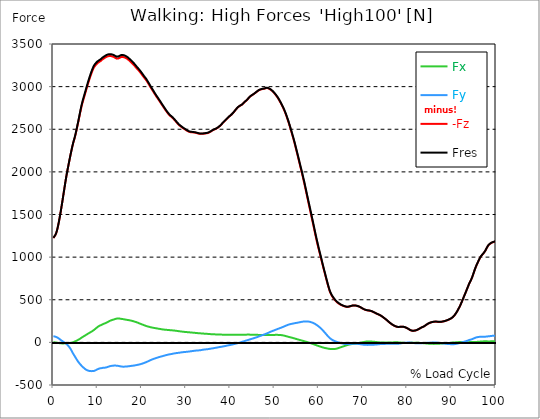
| Category |  Fx |  Fy |  -Fz |  Fres |
|---|---|---|---|---|
| 0.0 | 1.688 | 72.598 | 1223.997 | 1226.403 |
| 0.1646090534979424 | 0.781 | 70.536 | 1236.544 | 1238.81 |
| 0.3292181069958848 | -0.125 | 68.489 | 1249.107 | 1251.217 |
| 0.5041152263374485 | -1 | 66.176 | 1263.28 | 1265.218 |
| 0.668724279835391 | -2.016 | 63.223 | 1285.094 | 1286.86 |
| 0.8333333333333333 | -3.594 | 59.175 | 1314.346 | 1315.893 |
| 0.9979423868312757 | -5.344 | 53.894 | 1351.145 | 1352.473 |
| 1.162551440329218 | -7.125 | 48.128 | 1391.319 | 1392.429 |
| 1.337448559670782 | -8.751 | 41.612 | 1437.431 | 1438.353 |
| 1.5020576131687242 | -10.251 | 34.908 | 1485.247 | 1486.013 |
| 1.6666666666666665 | -11.094 | 28.08 | 1535.859 | 1536.453 |
| 1.831275720164609 | -11.751 | 21.658 | 1588.628 | 1589.097 |
| 1.9958847736625513 | -12.47 | 15.438 | 1641.616 | 1641.991 |
| 2.170781893004115 | -12.235 | 9.579 | 1696.963 | 1697.26 |
| 2.3353909465020575 | -11.969 | 4.172 | 1753.17 | 1753.435 |
| 2.4999999999999996 | -11.657 | -1.406 | 1808.173 | 1808.407 |
| 2.6646090534979425 | -11.423 | -7.125 | 1863.348 | 1863.598 |
| 2.829218106995885 | -11.079 | -13.204 | 1917.008 | 1917.289 |
| 3.0041152263374484 | -10.673 | -20.626 | 1967.136 | 1967.526 |
| 3.168724279835391 | -10.032 | -29.127 | 2014.201 | 2014.732 |
| 3.333333333333333 | -9.141 | -38.409 | 2058.266 | 2059.001 |
| 3.497942386831276 | -8.172 | -48.3 | 2101.488 | 2102.441 |
| 3.662551440329218 | -7.141 | -59.285 | 2144.725 | 2146.006 |
| 3.837448559670782 | -5.86 | -72.223 | 2187.384 | 2189.165 |
| 4.002057613168724 | -4.5 | -86.802 | 2228.761 | 2231.167 |
| 4.166666666666667 | -2.875 | -102.6 | 2268.201 | 2271.311 |
| 4.3312757201646095 | -0.969 | -118.992 | 2306.485 | 2310.297 |
| 4.495884773662552 | 1.844 | -134.696 | 2340.924 | 2345.518 |
| 4.670781893004115 | 5.797 | -148.712 | 2370.707 | 2376.145 |
| 4.835390946502058 | 9.735 | -162.729 | 2400.475 | 2406.772 |
| 4.999999999999999 | 13.923 | -176.839 | 2434.852 | 2442.087 |
| 5.164609053497943 | 18.064 | -190.934 | 2472.604 | 2480.776 |
| 5.329218106995885 | 22.095 | -205.013 | 2512.106 | 2521.248 |
| 5.504115226337448 | 26.658 | -218.154 | 2552.281 | 2562.422 |
| 5.668724279835391 | 31.268 | -230.577 | 2593.018 | 2604.112 |
| 5.833333333333333 | 36.237 | -242.015 | 2634.973 | 2646.974 |
| 5.997942386831276 | 41.456 | -252.922 | 2677.57 | 2690.43 |
| 6.162551440329218 | 47.722 | -261.938 | 2719.713 | 2733.37 |
| 6.337448559670782 | 53.503 | -271.751 | 2758.778 | 2773.326 |
| 6.502057613168724 | 59.144 | -281.252 | 2794.249 | 2809.609 |
| 6.666666666666666 | 64.77 | -289.33 | 2826.032 | 2842.127 |
| 6.831275720164609 | 70.082 | -297.003 | 2856.221 | 2873.019 |
| 6.995884773662552 | 75.067 | -304.362 | 2885.239 | 2902.708 |
| 7.170781893004115 | 80.567 | -312.019 | 2914.631 | 2932.757 |
| 7.3353909465020575 | 86.021 | -318.988 | 2944.305 | 2963.056 |
| 7.500000000000001 | 91.349 | -323.739 | 2974.791 | 2994.011 |
| 7.664609053497942 | 96.803 | -327.708 | 3005.105 | 3024.732 |
| 7.829218106995885 | 102.053 | -330.676 | 3033.998 | 3053.905 |
| 8.004115226337449 | 107.241 | -333.239 | 3061.327 | 3081.516 |
| 8.168724279835391 | 112.444 | -335.552 | 3088.204 | 3108.643 |
| 8.333333333333334 | 117.351 | -336.786 | 3114.284 | 3134.863 |
| 8.497942386831278 | 122.257 | -337.271 | 3139.614 | 3160.255 |
| 8.662551440329219 | 127.102 | -337.333 | 3164.334 | 3185.023 |
| 8.837448559670783 | 132.617 | -337.13 | 3186.585 | 3207.336 |
| 9.002057613168725 | 138.79 | -336.771 | 3206.555 | 3227.4 |
| 9.166666666666668 | 145.274 | -335.536 | 3224.337 | 3245.229 |
| 9.33127572016461 | 151.837 | -332.598 | 3238.26 | 3259.105 |
| 9.495884773662551 | 159.197 | -328.52 | 3249.089 | 3269.84 |
| 9.670781893004117 | 166.338 | -324.129 | 3258.98 | 3279.638 |
| 9.83539094650206 | 173.198 | -319.723 | 3268.543 | 3289.107 |
| 9.999999999999998 | 180.824 | -315.129 | 3276.419 | 3296.936 |
| 10.16460905349794 | 186.933 | -311.144 | 3283.294 | 3303.749 |
| 10.329218106995887 | 192.09 | -307.753 | 3288.732 | 3309.171 |
| 10.504115226337447 | 196.778 | -304.644 | 3293.451 | 3313.905 |
| 10.66872427983539 | 200.387 | -303.206 | 3299.717 | 3320.25 |
| 10.833333333333334 | 203.825 | -302.253 | 3306.858 | 3327.484 |
| 10.997942386831275 | 207.56 | -301.393 | 3315.046 | 3335.766 |
| 11.162551440329217 | 212.247 | -299.628 | 3322.031 | 3342.813 |
| 11.337448559670783 | 217.748 | -296.815 | 3327.969 | 3348.798 |
| 11.502057613168724 | 221.029 | -296.362 | 3331.313 | 3352.283 |
| 11.666666666666666 | 223.404 | -296.534 | 3338.563 | 3359.627 |
| 11.831275720164609 | 226.529 | -295.424 | 3344.767 | 3365.877 |
| 11.995884773662551 | 230.873 | -292.971 | 3349.47 | 3370.612 |
| 12.170781893004115 | 235.827 | -289.799 | 3353.033 | 3374.206 |
| 12.335390946502057 | 239.968 | -287.268 | 3356.158 | 3377.378 |
| 12.5 | 245.562 | -283.627 | 3358.049 | 3379.316 |
| 12.664609053497943 | 249.812 | -280.923 | 3358.924 | 3380.3 |
| 12.829218106995885 | 253.953 | -278.408 | 3359.049 | 3380.534 |
| 13.004115226337449 | 257.438 | -276.97 | 3358.361 | 3380.034 |
| 13.168724279835391 | 260.453 | -275.392 | 3356.674 | 3378.456 |
| 13.333333333333332 | 263.282 | -274.079 | 3354.533 | 3376.425 |
| 13.497942386831276 | 266.001 | -273.22 | 3351.564 | 3373.628 |
| 13.662551440329217 | 268.673 | -272.61 | 3348.001 | 3370.253 |
| 13.837448559670783 | 271.563 | -272.423 | 3342.845 | 3365.362 |
| 14.002057613168724 | 274.704 | -272.313 | 3336.938 | 3359.736 |
| 14.166666666666666 | 277.47 | -272.439 | 3331.875 | 3354.939 |
| 14.33127572016461 | 278.939 | -273.157 | 3328.5 | 3351.767 |
| 14.495884773662551 | 279.689 | -274.11 | 3327.828 | 3351.251 |
| 14.670781893004115 | 280.298 | -275.673 | 3329.422 | 3353.002 |
| 14.835390946502057 | 279.923 | -277.673 | 3333.016 | 3356.689 |
| 15.000000000000002 | 278.892 | -279.673 | 3338.126 | 3361.83 |
| 15.164609053497943 | 277.72 | -281.439 | 3343.72 | 3367.44 |
| 15.329218106995883 | 276.157 | -282.908 | 3347.314 | 3370.971 |
| 15.504115226337449 | 274.986 | -283.97 | 3348.361 | 3372.018 |
| 15.66872427983539 | 273.407 | -284.627 | 3348.111 | 3371.69 |
| 15.833333333333334 | 271.938 | -284.705 | 3346.767 | 3370.237 |
| 15.997942386831276 | 270.657 | -284.658 | 3344.064 | 3367.44 |
| 16.162551440329217 | 268.766 | -284.549 | 3340.766 | 3364.002 |
| 16.337448559670783 | 266.923 | -283.97 | 3336.829 | 3359.908 |
| 16.502057613168724 | 265.313 | -283.033 | 3332.563 | 3355.47 |
| 16.666666666666668 | 264.063 | -282.392 | 3327.094 | 3349.892 |
| 16.83127572016461 | 262.766 | -281.392 | 3320.515 | 3343.157 |
| 16.995884773662556 | 261.157 | -280.33 | 3313.405 | 3335.891 |
| 17.170781893004115 | 259.641 | -279.267 | 3305.608 | 3327.938 |
| 17.33539094650206 | 257.766 | -278.001 | 3297.608 | 3319.734 |
| 17.500000000000004 | 255.984 | -276.689 | 3289.716 | 3311.655 |
| 17.66460905349794 | 254 | -275.486 | 3281.544 | 3303.295 |
| 17.82921810699589 | 251.703 | -274.345 | 3273.184 | 3294.717 |
| 18.00411522633745 | 249.328 | -273.282 | 3264.559 | 3285.857 |
| 18.16872427983539 | 246.89 | -272.173 | 3255.792 | 3276.872 |
| 18.333333333333336 | 244.077 | -270.813 | 3246.026 | 3266.84 |
| 18.497942386831276 | 241.343 | -269.391 | 3235.604 | 3256.168 |
| 18.66255144032922 | 238.686 | -267.719 | 3224.947 | 3245.245 |
| 18.837448559670786 | 235.811 | -265.876 | 3214.743 | 3234.744 |
| 19.002057613168724 | 232.749 | -264.016 | 3205.039 | 3224.712 |
| 19.166666666666668 | 229.092 | -262.282 | 3196.195 | 3215.509 |
| 19.331275720164612 | 225.451 | -260.328 | 3186.679 | 3205.633 |
| 19.495884773662553 | 221.904 | -258.203 | 3176.335 | 3194.929 |
| 19.67078189300412 | 218.404 | -256.016 | 3165.474 | 3183.71 |
| 19.83539094650206 | 214.81 | -253.672 | 3154.333 | 3172.194 |
| 19.999999999999996 | 211.513 | -250.984 | 3142.77 | 3160.255 |
| 20.164609053497944 | 208.231 | -248.062 | 3131.019 | 3148.13 |
| 20.32921810699588 | 204.919 | -245.046 | 3119.565 | 3136.301 |
| 20.504115226337447 | 201.575 | -241.78 | 3108.002 | 3124.331 |
| 20.66872427983539 | 198.356 | -238.405 | 3097.22 | 3113.143 |
| 20.833333333333332 | 195.262 | -235.014 | 3086.642 | 3102.158 |
| 20.997942386831276 | 191.855 | -231.467 | 3074.891 | 3089.954 |
| 21.162551440329217 | 189.121 | -227.795 | 3061.953 | 3076.625 |
| 21.33744855967078 | 186.543 | -223.92 | 3047.999 | 3062.281 |
| 21.502057613168724 | 184.261 | -220.076 | 3034.17 | 3048.077 |
| 21.666666666666668 | 182.011 | -216.138 | 3019.809 | 3033.373 |
| 21.83127572016461 | 179.745 | -211.779 | 3004.996 | 3018.184 |
| 21.99588477366255 | 177.573 | -207.778 | 2990.683 | 3003.511 |
| 22.170781893004115 | 175.573 | -204.153 | 2977.057 | 2989.573 |
| 22.335390946502056 | 173.807 | -200.528 | 2963.54 | 2975.76 |
| 22.5 | 172.104 | -197.043 | 2949.727 | 2961.65 |
| 22.664609053497944 | 170.401 | -193.777 | 2935.57 | 2947.242 |
| 22.82921810699588 | 168.901 | -190.699 | 2921.6 | 2933.023 |
| 23.004115226337447 | 167.51 | -187.871 | 2907.896 | 2919.116 |
| 23.16872427983539 | 165.823 | -184.871 | 2894.067 | 2905.052 |
| 23.333333333333332 | 164.291 | -181.933 | 2881.066 | 2891.833 |
| 23.497942386831276 | 162.635 | -178.87 | 2869.41 | 2879.926 |
| 23.662551440329217 | 161.104 | -176.042 | 2856.346 | 2866.644 |
| 23.83744855967078 | 159.697 | -173.417 | 2843.033 | 2853.127 |
| 24.002057613168727 | 158.275 | -171.135 | 2830.267 | 2840.205 |
| 24.166666666666664 | 156.775 | -168.792 | 2817.438 | 2827.188 |
| 24.33127572016461 | 155.244 | -166.37 | 2804.64 | 2814.203 |
| 24.495884773662553 | 153.853 | -163.916 | 2791.42 | 2800.812 |
| 24.670781893004115 | 152.447 | -161.65 | 2778.466 | 2787.686 |
| 24.83539094650206 | 151.165 | -159.307 | 2765.45 | 2774.497 |
| 25.0 | 150.072 | -156.9 | 2752.449 | 2761.34 |
| 25.164609053497944 | 149.197 | -154.384 | 2739.511 | 2748.262 |
| 25.329218106995885 | 148.4 | -151.806 | 2726.666 | 2735.261 |
| 25.504115226337447 | 147.587 | -149.478 | 2714.322 | 2722.791 |
| 25.66872427983539 | 146.775 | -147.29 | 2702.337 | 2710.697 |
| 25.833333333333332 | 146.087 | -145.134 | 2690.867 | 2699.102 |
| 25.997942386831276 | 145.274 | -143.196 | 2679.82 | 2687.961 |
| 26.16255144032922 | 144.384 | -141.368 | 2669.554 | 2677.601 |
| 26.337448559670783 | 143.431 | -139.759 | 2660.178 | 2668.116 |
| 26.502057613168724 | 142.696 | -138.212 | 2653.209 | 2661.053 |
| 26.666666666666664 | 141.946 | -136.665 | 2646.255 | 2654.006 |
| 26.83127572016461 | 141.227 | -135.008 | 2639.052 | 2646.693 |
| 26.995884773662553 | 140.571 | -133.149 | 2631.395 | 2638.911 |
| 27.170781893004115 | 139.68 | -131.258 | 2622.207 | 2629.614 |
| 27.33539094650206 | 138.758 | -129.445 | 2612.253 | 2619.535 |
| 27.499999999999996 | 137.805 | -127.883 | 2602.596 | 2609.784 |
| 27.66460905349794 | 136.555 | -126.742 | 2592.736 | 2599.846 |
| 27.829218106995885 | 135.305 | -125.664 | 2582.673 | 2589.689 |
| 28.004115226337447 | 134.024 | -124.539 | 2572.329 | 2579.251 |
| 28.16872427983539 | 132.664 | -123.461 | 2562.438 | 2569.251 |
| 28.333333333333332 | 131.43 | -122.179 | 2553.218 | 2559.938 |
| 28.49794238683128 | 130.242 | -120.976 | 2545.655 | 2552.265 |
| 28.66255144032922 | 129.164 | -119.695 | 2538.53 | 2545.062 |
| 28.837448559670783 | 128.07 | -118.226 | 2531.811 | 2538.233 |
| 29.002057613168724 | 127.008 | -117.023 | 2525.264 | 2531.608 |
| 29.166666666666664 | 125.961 | -115.898 | 2518.794 | 2525.06 |
| 29.331275720164612 | 124.976 | -114.71 | 2512.638 | 2518.826 |
| 29.495884773662553 | 123.929 | -113.726 | 2506.919 | 2513.028 |
| 29.670781893004115 | 122.945 | -112.976 | 2501.418 | 2507.466 |
| 29.835390946502056 | 122.086 | -112.101 | 2495.965 | 2501.934 |
| 30.000000000000004 | 121.32 | -111.351 | 2490.293 | 2496.215 |
| 30.164609053497944 | 120.617 | -110.663 | 2483.98 | 2489.855 |
| 30.329218106995885 | 119.835 | -109.772 | 2478.651 | 2484.449 |
| 30.504115226337447 | 119.054 | -108.663 | 2474.026 | 2479.761 |
| 30.66872427983539 | 118.304 | -107.413 | 2470.213 | 2475.854 |
| 30.833333333333336 | 117.46 | -106.21 | 2467.744 | 2473.307 |
| 30.99794238683128 | 116.538 | -104.96 | 2466.119 | 2471.588 |
| 31.162551440329217 | 115.835 | -103.678 | 2464.994 | 2470.385 |
| 31.33744855967078 | 114.913 | -102.584 | 2464.166 | 2469.479 |
| 31.50205761316873 | 114.116 | -101.334 | 2463.479 | 2468.698 |
| 31.666666666666668 | 113.382 | -99.99 | 2462.682 | 2467.823 |
| 31.831275720164612 | 112.616 | -98.709 | 2461.525 | 2466.588 |
| 31.995884773662553 | 111.679 | -97.615 | 2460.088 | 2465.057 |
| 32.17078189300411 | 110.616 | -96.693 | 2458.4 | 2463.291 |
| 32.33539094650206 | 109.554 | -95.975 | 2456.337 | 2461.166 |
| 32.5 | 108.804 | -95.303 | 2453.978 | 2458.744 |
| 32.66460905349794 | 108.288 | -94.709 | 2451.118 | 2455.853 |
| 32.82921810699589 | 107.647 | -94.053 | 2448.681 | 2453.353 |
| 33.00411522633745 | 106.897 | -93.287 | 2447.04 | 2451.65 |
| 33.168724279835395 | 106.225 | -92.412 | 2445.962 | 2450.509 |
| 33.333333333333336 | 105.46 | -91.068 | 2445.681 | 2450.134 |
| 33.49794238683128 | 104.819 | -89.505 | 2445.79 | 2450.134 |
| 33.66255144032922 | 104.225 | -87.74 | 2446.087 | 2450.321 |
| 33.83744855967078 | 103.663 | -86.224 | 2446.774 | 2450.931 |
| 34.00205761316873 | 102.772 | -84.896 | 2447.946 | 2452.025 |
| 34.16666666666667 | 101.834 | -83.661 | 2449.228 | 2453.212 |
| 34.331275720164605 | 101.053 | -82.739 | 2450.493 | 2454.415 |
| 34.49588477366255 | 100.412 | -81.833 | 2451.743 | 2455.603 |
| 34.67078189300412 | 100.225 | -80.958 | 2452.884 | 2456.712 |
| 34.83539094650206 | 99.834 | -80.099 | 2454.619 | 2458.416 |
| 35.00000000000001 | 99.303 | -78.974 | 2457.15 | 2460.869 |
| 35.16460905349794 | 98.569 | -77.458 | 2461.025 | 2464.682 |
| 35.32921810699588 | 97.709 | -75.848 | 2465.588 | 2469.151 |
| 35.504115226337454 | 96.787 | -74.239 | 2470.62 | 2474.089 |
| 35.668724279835395 | 96.006 | -72.895 | 2475.901 | 2479.292 |
| 35.833333333333336 | 95.334 | -71.692 | 2481.339 | 2484.667 |
| 35.99794238683128 | 95.037 | -70.286 | 2487.089 | 2490.371 |
| 36.16255144032922 | 94.693 | -68.754 | 2491.793 | 2494.996 |
| 36.33744855967078 | 94.287 | -67.207 | 2496.121 | 2499.262 |
| 36.50205761316873 | 93.943 | -65.66 | 2499.809 | 2502.887 |
| 36.66666666666667 | 93.693 | -63.926 | 2502.981 | 2506.028 |
| 36.831275720164605 | 93.318 | -62.176 | 2507.403 | 2510.372 |
| 36.99588477366255 | 92.943 | -60.504 | 2512.45 | 2515.388 |
| 37.17078189300412 | 92.615 | -58.832 | 2517.904 | 2520.795 |
| 37.33539094650206 | 92.271 | -57.16 | 2524.045 | 2526.889 |
| 37.5 | 92.021 | -55.519 | 2531.092 | 2533.889 |
| 37.66460905349794 | 91.74 | -54.144 | 2538.608 | 2541.358 |
| 37.82921810699589 | 91.412 | -52.8 | 2546.374 | 2549.093 |
| 38.00411522633745 | 91.052 | -51.363 | 2555.562 | 2558.234 |
| 38.168724279835395 | 90.631 | -49.769 | 2566.36 | 2569.016 |
| 38.333333333333336 | 90.506 | -48.237 | 2575.829 | 2578.439 |
| 38.49794238683127 | 90.506 | -46.44 | 2584.205 | 2586.767 |
| 38.662551440329224 | 90.412 | -44.55 | 2592.549 | 2595.065 |
| 38.83744855967078 | 90.24 | -42.831 | 2601.424 | 2603.909 |
| 39.00205761316872 | 90.052 | -41.081 | 2610.112 | 2612.566 |
| 39.16666666666667 | 89.865 | -39.065 | 2618.785 | 2621.191 |
| 39.331275720164605 | 89.693 | -37.096 | 2627.317 | 2629.661 |
| 39.49588477366255 | 89.599 | -35.174 | 2636.036 | 2638.349 |
| 39.67078189300412 | 89.537 | -33.424 | 2644.849 | 2647.13 |
| 39.83539094650206 | 89.365 | -31.689 | 2652.349 | 2654.6 |
| 39.99999999999999 | 89.24 | -30.049 | 2658.49 | 2660.725 |
| 40.16460905349794 | 89.084 | -28.345 | 2665.96 | 2668.163 |
| 40.32921810699589 | 88.896 | -26.486 | 2674.554 | 2676.742 |
| 40.50411522633745 | 88.724 | -24.58 | 2683.398 | 2685.57 |
| 40.668724279835395 | 88.724 | -22.673 | 2692.805 | 2694.961 |
| 40.83333333333333 | 88.755 | -20.564 | 2703.118 | 2705.259 |
| 40.99794238683128 | 88.74 | -18.392 | 2713.353 | 2715.478 |
| 41.16255144032922 | 88.724 | -16.048 | 2724.01 | 2726.151 |
| 41.33744855967078 | 88.662 | -13.798 | 2735.011 | 2737.12 |
| 41.50205761316872 | 88.787 | -11.719 | 2745.277 | 2747.371 |
| 41.666666666666664 | 89.068 | -9.61 | 2754.512 | 2756.637 |
| 41.83127572016461 | 89.209 | -7.016 | 2762.387 | 2764.528 |
| 41.99588477366255 | 89.193 | -4.36 | 2768.794 | 2770.935 |
| 42.17078189300412 | 89.474 | -1.875 | 2774.279 | 2776.388 |
| 42.33539094650206 | 89.646 | 0.734 | 2779.138 | 2781.217 |
| 42.5 | 89.896 | 3.453 | 2783.717 | 2785.779 |
| 42.66460905349794 | 90.365 | 6.11 | 2789.217 | 2791.28 |
| 42.82921810699589 | 90.49 | 8.719 | 2797.311 | 2799.39 |
| 43.00411522633745 | 90.318 | 11.704 | 2806.968 | 2809.046 |
| 43.16872427983539 | 90.052 | 14.72 | 2816.359 | 2818.422 |
| 43.333333333333336 | 90.131 | 17.392 | 2823.922 | 2825.985 |
| 43.49794238683128 | 90.521 | 19.767 | 2830.673 | 2832.751 |
| 43.66255144032922 | 90.849 | 22.173 | 2837.658 | 2839.751 |
| 43.83744855967078 | 90.974 | 24.845 | 2846.017 | 2848.143 |
| 44.00205761316873 | 91.146 | 27.611 | 2855.971 | 2858.128 |
| 44.166666666666664 | 91.177 | 30.361 | 2866.534 | 2868.706 |
| 44.33127572016461 | 90.99 | 33.19 | 2876.238 | 2878.41 |
| 44.49588477366255 | 90.615 | 36.096 | 2884.129 | 2886.301 |
| 44.67078189300411 | 90.256 | 38.627 | 2891.051 | 2893.255 |
| 44.835390946502066 | 90.287 | 41.003 | 2896.911 | 2899.146 |
| 45.0 | 90.49 | 43.659 | 2902.021 | 2904.318 |
| 45.16460905349794 | 90.787 | 46.331 | 2907.427 | 2909.756 |
| 45.32921810699589 | 90.693 | 49.128 | 2913.803 | 2916.178 |
| 45.504115226337454 | 90.443 | 52.066 | 2920.178 | 2922.585 |
| 45.668724279835395 | 90.162 | 55.019 | 2926.569 | 2929.007 |
| 45.83333333333333 | 89.787 | 57.691 | 2933.257 | 2935.726 |
| 45.99794238683128 | 89.177 | 60.551 | 2939.976 | 2942.476 |
| 46.16255144032922 | 88.209 | 63.723 | 2946.742 | 2949.258 |
| 46.33744855967078 | 87.708 | 67.02 | 2952.962 | 2955.509 |
| 46.50205761316873 | 87.271 | 70.364 | 2958.352 | 2960.946 |
| 46.666666666666664 | 86.974 | 73.77 | 2962.462 | 2965.103 |
| 46.831275720164605 | 86.755 | 76.833 | 2965.337 | 2968.009 |
| 46.99588477366255 | 86.63 | 79.927 | 2968.478 | 2971.197 |
| 47.17078189300412 | 86.755 | 83.177 | 2970.963 | 2973.76 |
| 47.33539094650206 | 86.771 | 86.318 | 2972.369 | 2975.244 |
| 47.5 | 86.943 | 89.474 | 2973.166 | 2976.104 |
| 47.66460905349794 | 87.13 | 92.803 | 2974.76 | 2977.776 |
| 47.82921810699588 | 86.833 | 96.006 | 2978.072 | 2981.151 |
| 48.004115226337454 | 86.427 | 99.319 | 2981.291 | 2984.448 |
| 48.168724279835395 | 85.755 | 102.834 | 2983.745 | 2986.979 |
| 48.33333333333333 | 85.302 | 106.381 | 2984.198 | 2987.557 |
| 48.49794238683128 | 85.458 | 110.132 | 2981.885 | 2985.385 |
| 48.66255144032922 | 85.849 | 113.976 | 2978.291 | 2981.948 |
| 48.83744855967078 | 86.255 | 118.148 | 2973.619 | 2977.447 |
| 49.00205761316873 | 86.771 | 122.07 | 2968.416 | 2972.431 |
| 49.166666666666664 | 87.208 | 125.789 | 2962.275 | 2966.478 |
| 49.331275720164605 | 87.63 | 129.336 | 2955.727 | 2960.103 |
| 49.49588477366255 | 87.74 | 132.696 | 2947.977 | 2952.508 |
| 49.67078189300412 | 87.787 | 135.946 | 2939.789 | 2944.492 |
| 49.83539094650206 | 87.74 | 139.055 | 2931.038 | 2935.914 |
| 50.0 | 87.677 | 142.431 | 2920.506 | 2925.569 |
| 50.16460905349794 | 88.177 | 146.118 | 2909.724 | 2915.006 |
| 50.32921810699589 | 88.302 | 149.665 | 2898.802 | 2904.255 |
| 50.504115226337454 | 88.24 | 152.9 | 2886.911 | 2892.552 |
| 50.668724279835395 | 88.084 | 156.197 | 2873.941 | 2879.801 |
| 50.83333333333333 | 87.755 | 159.447 | 2860.534 | 2866.581 |
| 50.99794238683128 | 87.427 | 162.604 | 2846.455 | 2852.705 |
| 51.162551440329224 | 86.958 | 165.901 | 2830.704 | 2837.158 |
| 51.33744855967078 | 86.333 | 169.151 | 2814.781 | 2821.438 |
| 51.50205761316873 | 85.458 | 172.464 | 2798.405 | 2805.265 |
| 51.666666666666664 | 84.302 | 175.995 | 2781.264 | 2788.358 |
| 51.83127572016461 | 82.927 | 179.636 | 2764.012 | 2771.31 |
| 51.99588477366255 | 81.13 | 183.074 | 2745.511 | 2753.043 |
| 52.17078189300412 | 79.224 | 186.777 | 2726.229 | 2734.011 |
| 52.335390946502066 | 77.114 | 190.355 | 2705.603 | 2713.619 |
| 52.5 | 74.801 | 193.981 | 2683.351 | 2691.649 |
| 52.66460905349795 | 72.27 | 197.746 | 2659.162 | 2667.725 |
| 52.82921810699588 | 69.817 | 201.403 | 2634.411 | 2643.271 |
| 53.00411522633745 | 67.442 | 204.794 | 2609.237 | 2618.379 |
| 53.1687242798354 | 65.051 | 207.935 | 2582.861 | 2592.283 |
| 53.33333333333333 | 62.769 | 210.622 | 2555.125 | 2564.813 |
| 53.49794238683128 | 60.519 | 212.81 | 2526.295 | 2536.217 |
| 53.66255144032922 | 58.3 | 214.904 | 2497.324 | 2507.481 |
| 53.83744855967078 | 56.019 | 216.904 | 2467.307 | 2477.714 |
| 54.00205761316873 | 53.8 | 218.826 | 2438.024 | 2448.681 |
| 54.166666666666664 | 51.534 | 220.623 | 2407.381 | 2418.273 |
| 54.33127572016461 | 49.112 | 222.248 | 2376.239 | 2387.38 |
| 54.495884773662546 | 46.628 | 223.982 | 2343.815 | 2355.206 |
| 54.67078189300412 | 44.065 | 225.608 | 2310.219 | 2321.892 |
| 54.835390946502066 | 41.456 | 227.326 | 2276.155 | 2288.093 |
| 54.99999999999999 | 38.94 | 228.983 | 2241.246 | 2253.497 |
| 55.16460905349795 | 36.377 | 230.577 | 2206.26 | 2218.823 |
| 55.32921810699588 | 33.861 | 232.186 | 2170.179 | 2183.086 |
| 55.50411522633745 | 31.346 | 233.874 | 2134.787 | 2148.053 |
| 55.668724279835395 | 28.877 | 235.655 | 2099.05 | 2112.723 |
| 55.83333333333333 | 26.455 | 237.514 | 2063.532 | 2077.627 |
| 55.99794238683128 | 24.064 | 239.499 | 2029.014 | 2043.562 |
| 56.162551440329224 | 21.611 | 241.077 | 1993.247 | 2008.232 |
| 56.33744855967078 | 19.189 | 242.562 | 1956.416 | 1971.823 |
| 56.50205761316873 | 16.782 | 243.718 | 1918.742 | 1934.587 |
| 56.666666666666664 | 14.282 | 244.859 | 1881.396 | 1897.663 |
| 56.83127572016461 | 11.829 | 245.343 | 1842.503 | 1859.16 |
| 56.99588477366256 | 9.391 | 245.452 | 1802.36 | 1819.392 |
| 57.17078189300412 | 6.875 | 245.202 | 1761.826 | 1779.202 |
| 57.335390946502066 | 4.313 | 244.984 | 1721.324 | 1739.044 |
| 57.49999999999999 | 1.75 | 244.702 | 1681.212 | 1699.276 |
| 57.66460905349794 | -0.859 | 244.077 | 1640.96 | 1659.336 |
| 57.829218106995896 | -3.5 | 242.843 | 1601.238 | 1619.865 |
| 58.00411522633745 | -6.297 | 241.093 | 1562.252 | 1581.065 |
| 58.168724279835395 | -9.219 | 238.64 | 1522.562 | 1541.5 |
| 58.33333333333333 | -12.251 | 235.827 | 1482.559 | 1501.576 |
| 58.49794238683128 | -15.313 | 232.733 | 1442.151 | 1461.199 |
| 58.662551440329224 | -18.407 | 229.53 | 1401.929 | 1421.009 |
| 58.83744855967078 | -21.579 | 225.92 | 1361.724 | 1380.787 |
| 59.00205761316873 | -24.798 | 221.545 | 1321.143 | 1340.082 |
| 59.16666666666666 | -28.002 | 216.576 | 1279.906 | 1298.657 |
| 59.33127572016461 | -31.127 | 211.279 | 1239.685 | 1258.202 |
| 59.49588477366256 | -34.299 | 205.434 | 1201.089 | 1219.246 |
| 59.67078189300411 | -37.377 | 199.372 | 1163.352 | 1181.135 |
| 59.835390946502066 | -40.456 | 193.043 | 1126.428 | 1143.789 |
| 60.00000000000001 | -43.409 | 186.324 | 1090.504 | 1107.38 |
| 60.16460905349794 | -46.315 | 179.308 | 1055.986 | 1072.3 |
| 60.32921810699589 | -49.097 | 171.464 | 1021.547 | 1037.235 |
| 60.50411522633745 | -51.925 | 163.135 | 987.232 | 1002.249 |
| 60.66872427983539 | -54.706 | 154.416 | 952.808 | 967.106 |
| 60.833333333333336 | -57.519 | 145.618 | 918.4 | 931.979 |
| 60.99794238683128 | -60.316 | 136.727 | 884.382 | 897.242 |
| 61.162551440329224 | -62.801 | 127.367 | 850.708 | 862.865 |
| 61.33744855967078 | -65.113 | 117.679 | 817.269 | 828.707 |
| 61.50205761316872 | -67.223 | 107.6 | 784.235 | 794.939 |
| 61.66666666666667 | -68.91 | 97.334 | 751.155 | 761.203 |
| 61.831275720164605 | -70.442 | 87.193 | 718.466 | 727.904 |
| 61.99588477366256 | -72.067 | 77.255 | 686.136 | 695.011 |
| 62.17078189300411 | -73.817 | 67.692 | 654.899 | 663.259 |
| 62.33539094650205 | -75.348 | 58.754 | 625.648 | 633.601 |
| 62.50000000000001 | -76.848 | 50.206 | 598.505 | 606.099 |
| 62.66460905349794 | -77.77 | 43.487 | 577.535 | 584.895 |
| 62.82921810699589 | -78.411 | 37.034 | 559.534 | 566.675 |
| 63.00411522633746 | -78.88 | 31.252 | 543.158 | 550.143 |
| 63.16872427983539 | -78.833 | 26.72 | 530.157 | 537.064 |
| 63.333333333333336 | -78.567 | 22.501 | 518.329 | 525.141 |
| 63.49794238683128 | -78.099 | 18.314 | 506.75 | 513.438 |
| 63.662551440329224 | -77.427 | 14.235 | 495.53 | 502.093 |
| 63.83744855967079 | -76.317 | 10.516 | 485.405 | 491.796 |
| 64.00205761316873 | -74.348 | 7.532 | 476.857 | 482.983 |
| 64.16666666666667 | -71.895 | 4.657 | 469.357 | 475.154 |
| 64.3312757201646 | -69.051 | 1.734 | 462.575 | 468.013 |
| 64.49588477366255 | -65.988 | -1.141 | 456.325 | 461.434 |
| 64.67078189300412 | -62.926 | -4.047 | 450.481 | 455.262 |
| 64.83539094650206 | -60.019 | -6.75 | 445.027 | 449.496 |
| 65.0 | -57.066 | -9.219 | 440.074 | 444.246 |
| 65.16460905349794 | -54.316 | -11.11 | 436.167 | 440.089 |
| 65.32921810699588 | -51.472 | -13.11 | 432.198 | 435.87 |
| 65.50411522633745 | -48.503 | -14.892 | 428.557 | 431.933 |
| 65.66872427983539 | -45.534 | -16.282 | 425.354 | 428.479 |
| 65.83333333333334 | -42.471 | -17.454 | 422.588 | 425.479 |
| 65.99794238683127 | -39.471 | -18.486 | 420.01 | 422.682 |
| 66.16255144032922 | -36.502 | -19.329 | 417.666 | 420.104 |
| 66.33744855967079 | -33.533 | -20.111 | 416.15 | 418.401 |
| 66.50205761316873 | -30.736 | -20.689 | 415.525 | 417.619 |
| 66.66666666666667 | -28.392 | -20.392 | 416.854 | 418.807 |
| 66.8312757201646 | -26.283 | -20.032 | 418.791 | 420.588 |
| 66.99588477366255 | -24.423 | -19.189 | 421.229 | 422.885 |
| 67.17078189300412 | -22.689 | -18.376 | 424.088 | 425.62 |
| 67.33539094650206 | -21.236 | -17.907 | 426.76 | 428.167 |
| 67.5 | -19.861 | -17.376 | 429.261 | 430.558 |
| 67.66460905349794 | -18.657 | -16.704 | 431.448 | 432.636 |
| 67.8292181069959 | -17.751 | -16.501 | 432.511 | 433.62 |
| 68.00411522633746 | -16.798 | -16.22 | 432.917 | 433.948 |
| 68.16872427983539 | -15.72 | -15.954 | 432.839 | 433.792 |
| 68.33333333333334 | -14.392 | -16.126 | 431.526 | 432.433 |
| 68.49794238683127 | -12.985 | -16.532 | 429.823 | 430.683 |
| 68.66255144032921 | -11.532 | -17.064 | 427.964 | 428.792 |
| 68.83744855967078 | -10.313 | -17.798 | 425.417 | 426.229 |
| 69.00205761316872 | -8.219 | -18.689 | 422.26 | 423.088 |
| 69.16666666666667 | -6.063 | -19.689 | 418.885 | 419.744 |
| 69.33127572016461 | -4.219 | -20.673 | 414.822 | 415.775 |
| 69.49588477366255 | -2.469 | -21.892 | 410.041 | 411.072 |
| 69.67078189300412 | -1.172 | -23.158 | 404.79 | 405.884 |
| 69.83539094650206 | 0.203 | -24.486 | 399.306 | 400.509 |
| 70.00000000000001 | 1.844 | -25.767 | 394.118 | 395.415 |
| 70.16460905349794 | 3.438 | -26.955 | 389.477 | 390.836 |
| 70.32921810699588 | 5.407 | -28.033 | 385.336 | 386.774 |
| 70.50411522633745 | 7.563 | -28.549 | 382.164 | 383.648 |
| 70.66872427983539 | 9.079 | -29.142 | 379.32 | 380.898 |
| 70.83333333333333 | 9.954 | -29.346 | 377.132 | 378.742 |
| 70.99794238683128 | 10.876 | -29.408 | 375.351 | 377.007 |
| 71.16255144032922 | 11.313 | -29.236 | 374.038 | 375.71 |
| 71.33744855967079 | 11.563 | -29.017 | 373.023 | 374.71 |
| 71.50205761316873 | 11.376 | -28.721 | 371.616 | 373.273 |
| 71.66666666666667 | 10.657 | -28.33 | 369.726 | 371.335 |
| 71.83127572016461 | 9.922 | -28.095 | 367.241 | 368.819 |
| 71.99588477366255 | 9.204 | -28.017 | 364.132 | 365.725 |
| 72.17078189300412 | 8.594 | -27.924 | 360.084 | 361.663 |
| 72.33539094650205 | 7.891 | -27.361 | 356.381 | 357.897 |
| 72.5 | 6.985 | -26.564 | 352.834 | 354.256 |
| 72.66460905349795 | 6.094 | -26.127 | 348.474 | 349.834 |
| 72.82921810699588 | 5.203 | -25.72 | 343.677 | 344.99 |
| 73.00411522633746 | 4.188 | -24.986 | 338.943 | 340.146 |
| 73.1687242798354 | 3.25 | -24.205 | 334.833 | 335.974 |
| 73.33333333333334 | 2.297 | -23.126 | 331.348 | 332.364 |
| 73.49794238683127 | 1.359 | -22.095 | 327.739 | 328.661 |
| 73.66255144032921 | 0.422 | -21.189 | 323.785 | 324.66 |
| 73.83744855967078 | -0.344 | -20.423 | 319.52 | 320.348 |
| 74.00205761316873 | -0.953 | -19.736 | 315.035 | 315.832 |
| 74.16666666666667 | -1.297 | -19.314 | 309.128 | 309.941 |
| 74.33127572016461 | -1.531 | -19.095 | 302.847 | 303.69 |
| 74.49588477366255 | -1.672 | -19.173 | 296.377 | 297.268 |
| 74.67078189300412 | -1.922 | -18.907 | 290.111 | 291.049 |
| 74.83539094650207 | -2.188 | -18.454 | 283.767 | 284.736 |
| 75.0 | -2.469 | -17.923 | 277.329 | 278.298 |
| 75.16460905349794 | -2.656 | -17.423 | 270.688 | 271.688 |
| 75.32921810699588 | -2.688 | -16.985 | 263.36 | 264.376 |
| 75.50411522633745 | -2.547 | -16.595 | 255.516 | 256.547 |
| 75.6687242798354 | -2.313 | -16.47 | 247.703 | 248.765 |
| 75.83333333333333 | -2.078 | -16.392 | 240.093 | 241.187 |
| 75.99794238683128 | -1.906 | -16.313 | 233.045 | 234.155 |
| 76.16255144032922 | -1.625 | -16.376 | 226.233 | 227.389 |
| 76.33744855967079 | -1.219 | -16.454 | 219.654 | 220.873 |
| 76.50205761316873 | -0.719 | -16.61 | 213.107 | 214.372 |
| 76.66666666666667 | -0.219 | -16.814 | 206.966 | 208.278 |
| 76.83127572016461 | 0.172 | -17.064 | 201.778 | 203.153 |
| 76.99588477366254 | 0.172 | -16.939 | 197.434 | 198.84 |
| 77.17078189300412 | 0.25 | -17.048 | 193.137 | 194.574 |
| 77.33539094650206 | 0.328 | -16.985 | 189.027 | 190.496 |
| 77.5 | 0.391 | -16.814 | 185.386 | 186.855 |
| 77.66460905349794 | 0.422 | -16.61 | 182.136 | 183.589 |
| 77.82921810699588 | 0.391 | -16.454 | 179.995 | 181.417 |
| 78.00411522633745 | -0.094 | -15.61 | 179.558 | 180.824 |
| 78.1687242798354 | -0.688 | -14.563 | 180.198 | 181.339 |
| 78.33333333333334 | -1.297 | -13.516 | 181.464 | 182.48 |
| 78.49794238683127 | -2 | -12.313 | 182.558 | 183.464 |
| 78.66255144032921 | -2.922 | -10.798 | 183.339 | 184.121 |
| 78.83744855967078 | -3.735 | -9.204 | 183.714 | 184.418 |
| 79.00205761316873 | -4.485 | -7.625 | 183.636 | 184.308 |
| 79.16666666666667 | -5.282 | -6.438 | 182.277 | 182.949 |
| 79.33127572016461 | -5.922 | -5.594 | 180.277 | 180.98 |
| 79.49588477366257 | -6.438 | -4.86 | 177.823 | 178.542 |
| 79.67078189300412 | -6.719 | -4.063 | 174.214 | 174.933 |
| 79.83539094650207 | -7.032 | -3.188 | 170.057 | 170.745 |
| 79.99999999999999 | -7.079 | -2.703 | 165.838 | 166.541 |
| 80.16460905349794 | -7.032 | -2.25 | 161.291 | 161.994 |
| 80.32921810699588 | -6.797 | -2.281 | 155.916 | 156.635 |
| 80.50411522633745 | -6.469 | -2.516 | 150.462 | 151.181 |
| 80.66872427983539 | -5.938 | -3.078 | 144.993 | 145.696 |
| 80.83333333333333 | -5.453 | -3.641 | 140.337 | 141.04 |
| 80.99794238683128 | -4.969 | -4.438 | 137.665 | 138.368 |
| 81.16255144032922 | -4.594 | -5.5 | 136.493 | 137.196 |
| 81.33744855967079 | -4.203 | -6.61 | 136.086 | 136.774 |
| 81.50205761316873 | -3.906 | -7.766 | 136.399 | 137.102 |
| 81.66666666666666 | -3.641 | -8.985 | 137.305 | 138.024 |
| 81.83127572016461 | -3.672 | -9.719 | 138.899 | 139.634 |
| 81.99588477366255 | -3.703 | -10.407 | 141.212 | 141.993 |
| 82.1707818930041 | -3.875 | -10.923 | 144.29 | 145.103 |
| 82.33539094650206 | -4.36 | -10.923 | 148.15 | 148.947 |
| 82.5 | -5.016 | -10.391 | 152.541 | 153.291 |
| 82.66460905349794 | -5.516 | -10.282 | 157.197 | 157.916 |
| 82.8292181069959 | -6.063 | -10.219 | 162.057 | 162.76 |
| 83.00411522633745 | -6.86 | -9.876 | 167.401 | 168.073 |
| 83.1687242798354 | -7.563 | -9.657 | 172.511 | 173.198 |
| 83.33333333333333 | -8.141 | -9.329 | 176.855 | 177.542 |
| 83.49794238683127 | -8.766 | -8.813 | 180.23 | 180.917 |
| 83.66255144032922 | -9.454 | -8.125 | 183.621 | 184.292 |
| 83.83744855967078 | -10.219 | -7.438 | 188.637 | 189.293 |
| 84.00205761316873 | -11.048 | -6.719 | 194.199 | 194.871 |
| 84.16666666666667 | -11.923 | -6.329 | 200.403 | 201.09 |
| 84.33127572016461 | -12.766 | -6.032 | 206.7 | 207.403 |
| 84.49588477366257 | -13.516 | -5.578 | 212.45 | 213.169 |
| 84.67078189300412 | -14.266 | -5.016 | 217.67 | 218.388 |
| 84.83539094650206 | -14.845 | -4.532 | 222.357 | 223.092 |
| 85.0 | -15.454 | -3.985 | 226.67 | 227.42 |
| 85.16460905349794 | -16.017 | -3.531 | 230.42 | 231.202 |
| 85.32921810699588 | -16.439 | -3.297 | 233.53 | 234.342 |
| 85.50411522633745 | -16.751 | -3.094 | 236.03 | 236.874 |
| 85.66872427983539 | -17.11 | -3.047 | 237.858 | 238.733 |
| 85.83333333333334 | -17.454 | -2.766 | 239.702 | 240.593 |
| 85.99794238683128 | -17.689 | -2.203 | 241.562 | 242.484 |
| 86.16255144032922 | -17.548 | -2.188 | 242.749 | 243.671 |
| 86.33744855967078 | -17.47 | -2.375 | 243.155 | 244.109 |
| 86.50205761316873 | -17.282 | -2.61 | 243.124 | 244.077 |
| 86.66666666666667 | -17.048 | -3 | 242.577 | 243.562 |
| 86.8312757201646 | -16.626 | -3.703 | 241.468 | 242.437 |
| 86.99588477366255 | -16.063 | -4.891 | 240.39 | 241.343 |
| 87.17078189300412 | -15.454 | -6.344 | 239.593 | 240.53 |
| 87.33539094650206 | -14.954 | -7.485 | 239.561 | 240.515 |
| 87.5 | -14.47 | -8.329 | 239.874 | 240.843 |
| 87.66460905349794 | -13.829 | -9.454 | 240.593 | 241.546 |
| 87.8292181069959 | -13.141 | -10.626 | 241.905 | 242.859 |
| 88.00411522633746 | -12.501 | -11.516 | 243.655 | 244.593 |
| 88.1687242798354 | -11.735 | -12.516 | 245.406 | 246.374 |
| 88.33333333333333 | -11.032 | -13.579 | 247.406 | 248.39 |
| 88.49794238683127 | -10.516 | -14.845 | 249.546 | 250.562 |
| 88.66255144032922 | -9.969 | -15.97 | 252.265 | 253.312 |
| 88.83744855967079 | -9.454 | -16.97 | 255.281 | 256.359 |
| 89.00205761316872 | -8.672 | -17.939 | 258.391 | 259.516 |
| 89.16666666666667 | -8 | -18.876 | 261.969 | 263.141 |
| 89.33127572016461 | -7.266 | -19.298 | 265.735 | 266.907 |
| 89.49588477366255 | -6.36 | -19.782 | 269.376 | 270.532 |
| 89.67078189300413 | -5.657 | -20.314 | 273.72 | 274.876 |
| 89.83539094650206 | -4.813 | -20.892 | 278.079 | 279.22 |
| 90.0 | -3.875 | -21.376 | 283.127 | 284.252 |
| 90.16460905349794 | -3.094 | -21.595 | 289.596 | 290.705 |
| 90.32921810699588 | -2.453 | -21.579 | 296.956 | 298.018 |
| 90.50411522633745 | -1.781 | -21.314 | 305.019 | 306.019 |
| 90.66872427983539 | -1.109 | -20.704 | 314.754 | 315.707 |
| 90.83333333333334 | -0.203 | -19.845 | 326.317 | 327.161 |
| 90.99794238683127 | 0.547 | -18.611 | 338.943 | 339.708 |
| 91.16255144032922 | 1.172 | -16.907 | 352.522 | 353.225 |
| 91.33744855967079 | 1.797 | -14.907 | 367.272 | 367.882 |
| 91.50205761316873 | 2.438 | -12.923 | 382.961 | 383.508 |
| 91.66666666666666 | 3.11 | -10.938 | 399.227 | 399.696 |
| 91.8312757201646 | 3.797 | -8.672 | 415.807 | 416.229 |
| 91.99588477366255 | 4.235 | -6.172 | 433.62 | 433.98 |
| 92.17078189300412 | 4.078 | -3.578 | 453.168 | 453.481 |
| 92.33539094650206 | 3.766 | -1.094 | 473.357 | 473.623 |
| 92.5 | 3.453 | 1.656 | 494.39 | 494.624 |
| 92.66460905349794 | 3.172 | 4.344 | 515.688 | 515.922 |
| 92.8292181069959 | 2.906 | 6.813 | 536.705 | 536.955 |
| 93.00411522633746 | 2.875 | 9.532 | 557.815 | 558.097 |
| 93.1687242798354 | 2.875 | 12.016 | 578.629 | 578.942 |
| 93.33333333333333 | 2.797 | 14.751 | 599.818 | 600.193 |
| 93.49794238683128 | 2.688 | 17.517 | 621.241 | 621.694 |
| 93.66255144032921 | 2.547 | 20.642 | 643.367 | 643.899 |
| 93.83744855967079 | 2.531 | 23.908 | 664.728 | 665.369 |
| 94.00205761316872 | 2.75 | 27.174 | 685.448 | 686.214 |
| 94.16666666666667 | 3.172 | 30.189 | 704.481 | 705.356 |
| 94.33127572016461 | 3.875 | 32.127 | 720.997 | 721.95 |
| 94.49588477366255 | 4.328 | 34.736 | 739.373 | 740.42 |
| 94.67078189300412 | 4.578 | 37.924 | 760.312 | 761.484 |
| 94.83539094650206 | 4.735 | 41.018 | 783.204 | 784.485 |
| 95.0 | 4.516 | 45.143 | 808.924 | 810.362 |
| 95.16460905349794 | 4.375 | 49.05 | 834.707 | 836.332 |
| 95.32921810699588 | 4.407 | 52.534 | 859.318 | 861.099 |
| 95.50411522633745 | 4.766 | 55.863 | 881.679 | 883.632 |
| 95.66872427983539 | 5.391 | 59.019 | 902.821 | 904.93 |
| 95.83333333333334 | 5.969 | 60.488 | 921.322 | 923.494 |
| 95.99794238683128 | 6.672 | 62.223 | 940.511 | 942.745 |
| 96.16255144032922 | 7.5 | 63.66 | 958.996 | 961.293 |
| 96.33744855967079 | 8.282 | 64.691 | 977.232 | 979.544 |
| 96.50205761316873 | 8.969 | 65.379 | 993.826 | 996.155 |
| 96.66666666666666 | 9.704 | 65.738 | 1007.046 | 1009.358 |
| 96.83127572016461 | 10.36 | 65.504 | 1018.593 | 1020.875 |
| 96.99588477366255 | 11.032 | 65.254 | 1028.891 | 1031.125 |
| 97.17078189300412 | 11.657 | 65.191 | 1038.985 | 1041.189 |
| 97.33539094650206 | 12.188 | 65.348 | 1049.017 | 1051.22 |
| 97.5 | 12.516 | 65.879 | 1060.408 | 1062.612 |
| 97.66460905349795 | 12.688 | 66.863 | 1074.362 | 1076.613 |
| 97.8292181069959 | 12.61 | 67.832 | 1090.238 | 1092.504 |
| 98.00411522633746 | 12.329 | 68.723 | 1106.896 | 1109.193 |
| 98.1687242798354 | 11.735 | 70.004 | 1123.037 | 1125.381 |
| 98.33333333333333 | 11.141 | 70.864 | 1136.241 | 1138.601 |
| 98.49794238683128 | 10.969 | 71.723 | 1146.648 | 1149.07 |
| 98.66255144032921 | 11.36 | 72.583 | 1153.492 | 1155.977 |
| 98.83744855967078 | 11.985 | 74.114 | 1159.79 | 1162.368 |
| 99.00205761316873 | 12.376 | 75.364 | 1165.227 | 1167.884 |
| 99.16666666666667 | 12.563 | 76.255 | 1169.446 | 1172.15 |
| 99.33127572016461 | 12.735 | 77.036 | 1173.478 | 1176.212 |
| 99.49588477366255 | 12.923 | 77.849 | 1176.869 | 1179.65 |
| 99.67078189300412 | 12.845 | 78.27 | 1178.509 | 1181.306 |
| 99.83539094650207 | 12.735 | 78.755 | 1180.65 | 1183.478 |
| 100.0 | 12.595 | 79.427 | 1184.838 | 1187.713 |